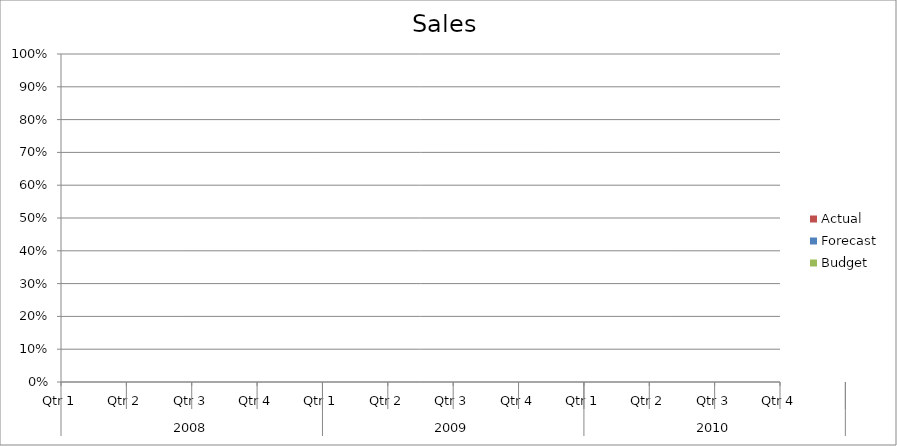
| Category | Budget | Forecast | Actual |
|---|---|---|---|
| 0 | 2050 | 3310 | 3000 |
| 1 | 3040 | 1500 | 2110 |
| 2 | 670 | 730 | 1790 |
| 3 | 810 | 1740 | 3400 |
| 4 | 3140 | 2830 | 1920 |
| 5 | 690 | 2090 | 1060 |
| 6 | 2280 | 1230 | 3080 |
| 7 | 2590 | 900 | 1440 |
| 8 | 540 | 700 | 2120 |
| 9 | 2210 | 2530 | 3260 |
| 10 | 1650 | 790 | 1700 |
| 11 | 3260 | 3080 | 1570 |